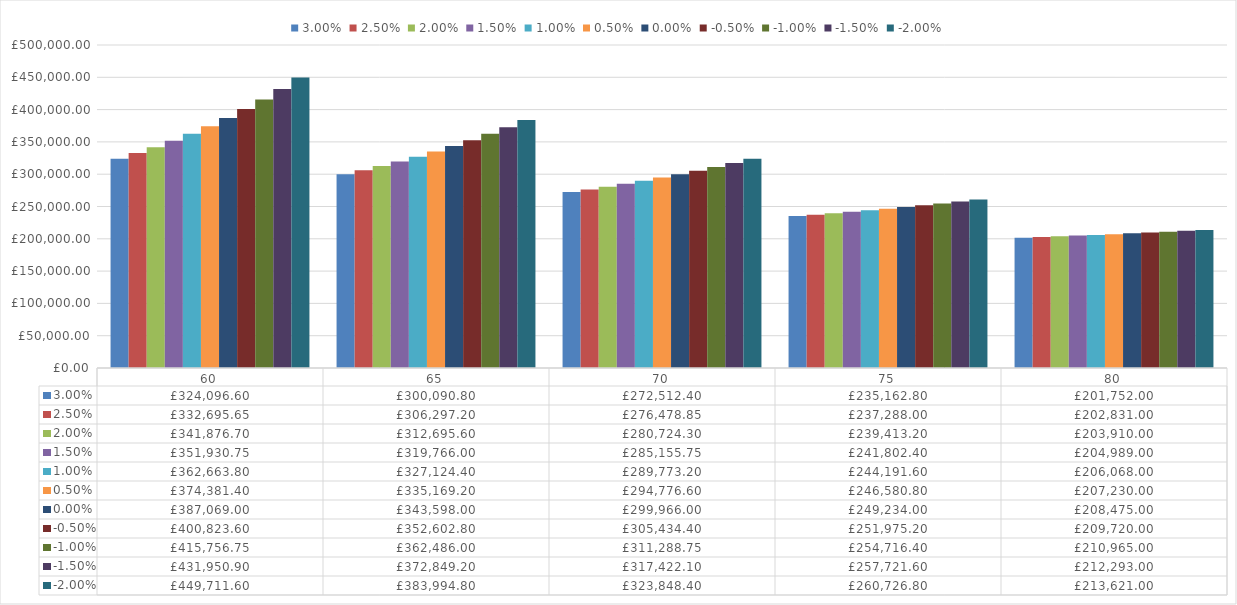
| Category | 3.00% | 2.50% | 2.00% | 1.50% | 1.00% | 0.50% | 0.00% | -0.50% | -1.00% | -1.50% | -2.00% |
|---|---|---|---|---|---|---|---|---|---|---|---|
| 60.0 | 324096.6 | 332695.65 | 341876.7 | 351930.75 | 362663.8 | 374381.4 | 387069 | 400823.6 | 415756.75 | 431950.9 | 449711.6 |
| 65.0 | 300090.8 | 306297.2 | 312695.6 | 319766 | 327124.4 | 335169.2 | 343598 | 352602.8 | 362486 | 372849.2 | 383994.8 |
| 70.0 | 272512.4 | 276478.85 | 280724.3 | 285155.75 | 289773.2 | 294776.6 | 299966 | 305434.4 | 311288.75 | 317422.1 | 323848.4 |
| 75.0 | 235162.8 | 237288 | 239413.2 | 241802.4 | 244191.6 | 246580.8 | 249234 | 251975.2 | 254716.4 | 257721.6 | 260726.8 |
| 80.0 | 201752 | 202831 | 203910 | 204989 | 206068 | 207230 | 208475 | 209720 | 210965 | 212293 | 213621 |